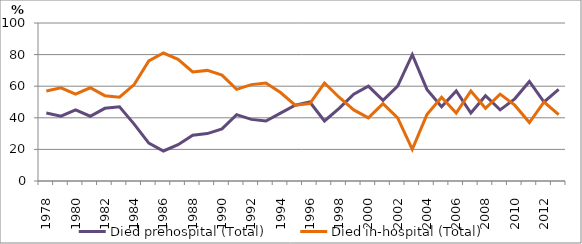
| Category | Died prehospital (Total) | Died in-hospital (Total) |
|---|---|---|
| 1978.0 | 43 | 57 |
| 1979.0 | 41 | 59 |
| 1980.0 | 45 | 55 |
| 1981.0 | 41 | 59 |
| 1982.0 | 46 | 54 |
| 1983.0 | 47 | 53 |
| 1984.0 | 36 | 61 |
| 1985.0 | 24 | 76 |
| 1986.0 | 19 | 81 |
| 1987.0 | 23 | 77 |
| 1988.0 | 29 | 69 |
| 1989.0 | 30 | 70 |
| 1990.0 | 33 | 67 |
| 1991.0 | 42 | 58 |
| 1992.0 | 39 | 61 |
| 1993.0 | 38 | 62 |
| 1994.0 | 43 | 56 |
| 1995.0 | 48 | 48 |
| 1996.0 | 50 | 49 |
| 1997.0 | 38 | 62 |
| 1998.0 | 46 | 53 |
| 1999.0 | 55 | 45 |
| 2000.0 | 60 | 40 |
| 2001.0 | 51 | 49 |
| 2002.0 | 60 | 40 |
| 2003.0 | 80 | 20 |
| 2004.0 | 58 | 42 |
| 2005.0 | 47 | 53 |
| 2006.0 | 57 | 43 |
| 2007.0 | 43 | 57 |
| 2008.0 | 54 | 46 |
| 2009.0 | 45 | 55 |
| 2010.0 | 52 | 48 |
| 2011.0 | 63 | 37 |
| 2012.0 | 50 | 50 |
| 2013.0 | 58 | 42 |